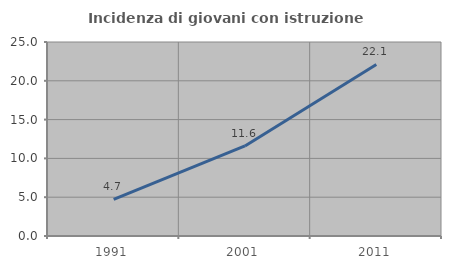
| Category | Incidenza di giovani con istruzione universitaria |
|---|---|
| 1991.0 | 4.724 |
| 2001.0 | 11.604 |
| 2011.0 | 22.109 |